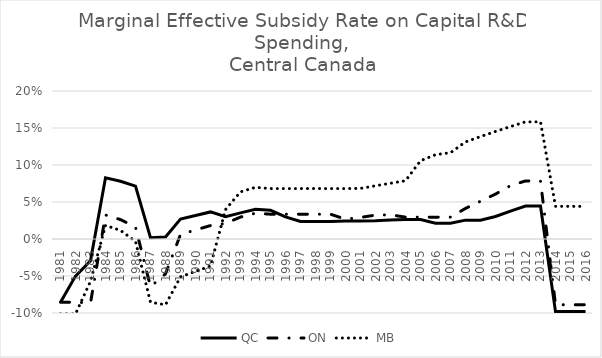
| Category | QC | ON | MB |
|---|---|---|---|
| 1981.0 | -0.085 | -0.085 | -0.101 |
| 1982.0 | -0.05 | -0.085 | -0.101 |
| 1983.0 | -0.029 | -0.086 | -0.057 |
| 1984.0 | 0.083 | 0.032 | 0.018 |
| 1985.0 | 0.078 | 0.026 | 0.012 |
| 1986.0 | 0.072 | 0.016 | -0.003 |
| 1987.0 | 0.002 | -0.065 | -0.085 |
| 1988.0 | 0.003 | -0.047 | -0.089 |
| 1989.0 | 0.027 | 0.006 | -0.051 |
| 1990.0 | 0.032 | 0.012 | -0.044 |
| 1991.0 | 0.037 | 0.018 | -0.037 |
| 1992.0 | 0.03 | 0.021 | 0.04 |
| 1993.0 | 0.035 | 0.03 | 0.064 |
| 1994.0 | 0.04 | 0.035 | 0.07 |
| 1995.0 | 0.039 | 0.033 | 0.068 |
| 1996.0 | 0.03 | 0.033 | 0.068 |
| 1997.0 | 0.024 | 0.033 | 0.068 |
| 1998.0 | 0.024 | 0.033 | 0.068 |
| 1999.0 | 0.024 | 0.033 | 0.068 |
| 2000.0 | 0.024 | 0.027 | 0.068 |
| 2001.0 | 0.024 | 0.029 | 0.068 |
| 2002.0 | 0.025 | 0.032 | 0.072 |
| 2003.0 | 0.026 | 0.033 | 0.075 |
| 2004.0 | 0.026 | 0.03 | 0.079 |
| 2005.0 | 0.026 | 0.03 | 0.106 |
| 2006.0 | 0.021 | 0.03 | 0.114 |
| 2007.0 | 0.021 | 0.03 | 0.117 |
| 2008.0 | 0.025 | 0.041 | 0.131 |
| 2009.0 | 0.025 | 0.051 | 0.138 |
| 2010.0 | 0.03 | 0.061 | 0.145 |
| 2011.0 | 0.038 | 0.072 | 0.152 |
| 2012.0 | 0.045 | 0.078 | 0.158 |
| 2013.0 | 0.045 | 0.078 | 0.158 |
| 2014.0 | -0.098 | -0.089 | 0.044 |
| 2015.0 | -0.098 | -0.089 | 0.044 |
| 2016.0 | -0.098 | -0.089 | 0.044 |